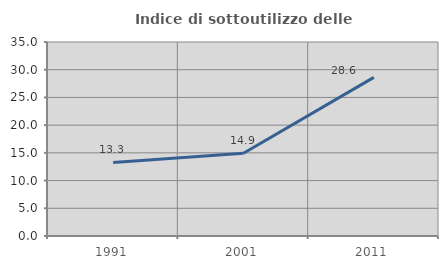
| Category | Indice di sottoutilizzo delle abitazioni  |
|---|---|
| 1991.0 | 13.265 |
| 2001.0 | 14.925 |
| 2011.0 | 28.61 |